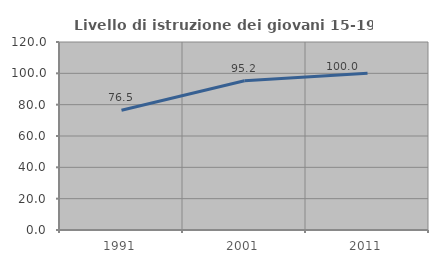
| Category | Livello di istruzione dei giovani 15-19 anni |
|---|---|
| 1991.0 | 76.471 |
| 2001.0 | 95.238 |
| 2011.0 | 100 |